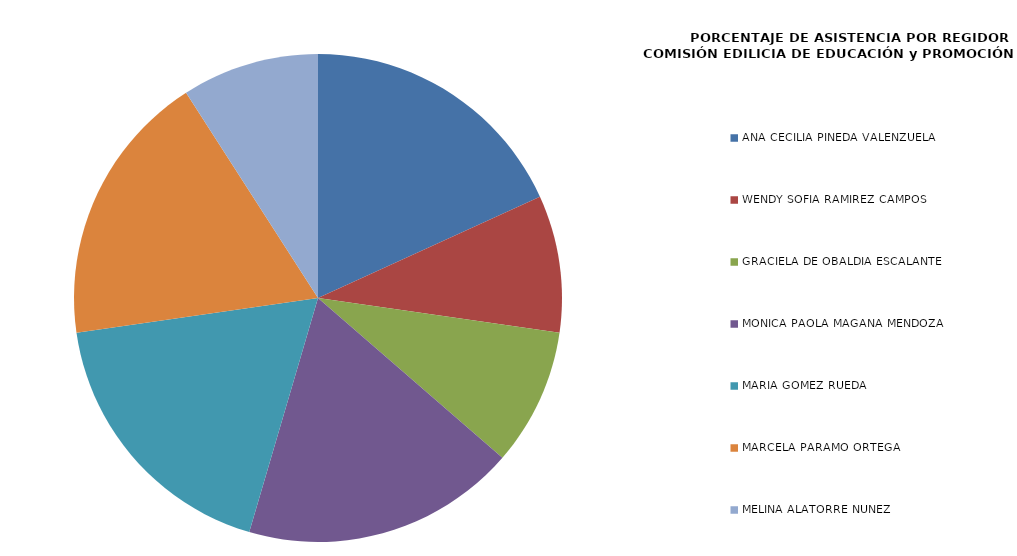
| Category | Series 0 |
|---|---|
| ANA CECILIA PINEDA VALENZUELA | 100 |
| WENDY SOFÍA RAMÍREZ CAMPOS | 50 |
| GRACIELA DE OBALDÍA ESCALANTE | 50 |
| MÓNICA PAOLA MAGAÑA MENDOZA | 100 |
| MARÍA GÓMEZ RUEDA | 100 |
| MARCELA PÁRAMO ORTEGA | 100 |
| MELINA ALATORRE NÚÑEZ | 50 |